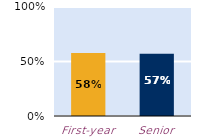
| Category | frequently |
|---|---|
| First-year | 0.577 |
| Senior | 0.572 |